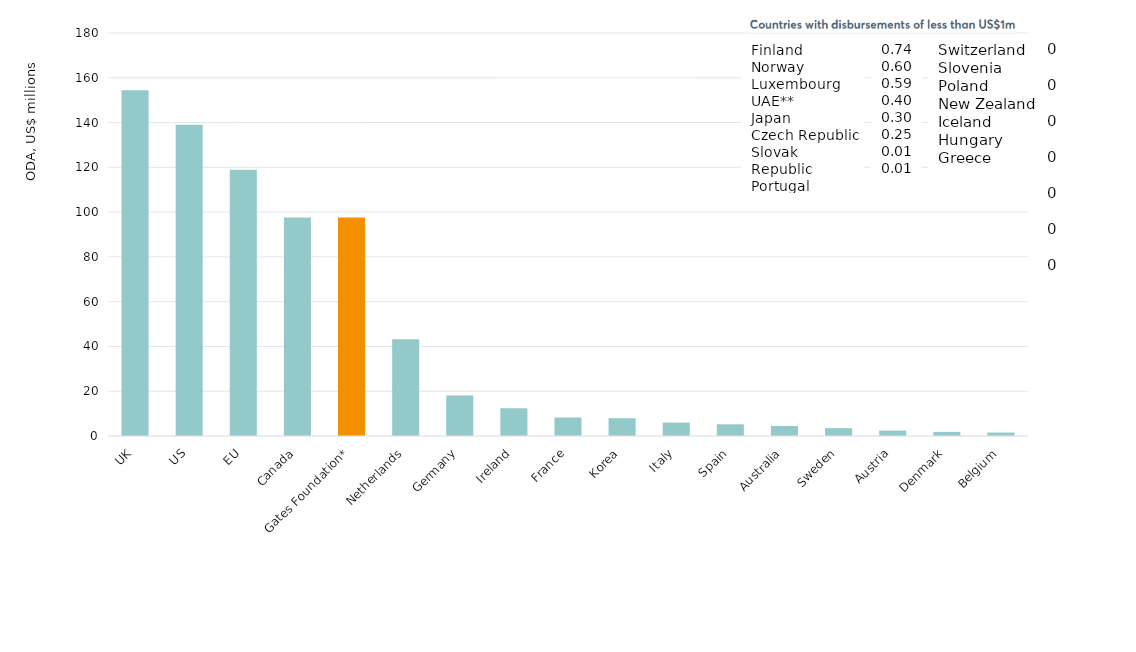
| Category | Series 0 |
|---|---|
| Belgium | 1.547 |
| Denmark | 1.843 |
| Austria | 2.427 |
| Sweden | 3.52 |
| Australia | 4.484 |
| Spain | 5.232 |
| Italy | 6.001 |
| Korea | 7.938 |
| France | 8.264 |
| Ireland | 12.387 |
| Germany | 18.047 |
| Netherlands | 43.191 |
| Gates Foundation* | 97.612 |
| Canada | 97.628 |
| EU | 118.956 |
| US | 139.008 |
| UK | 154.426 |